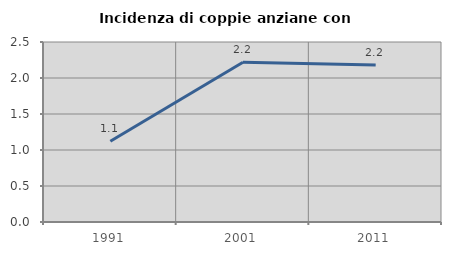
| Category | Incidenza di coppie anziane con figli |
|---|---|
| 1991.0 | 1.121 |
| 2001.0 | 2.22 |
| 2011.0 | 2.182 |